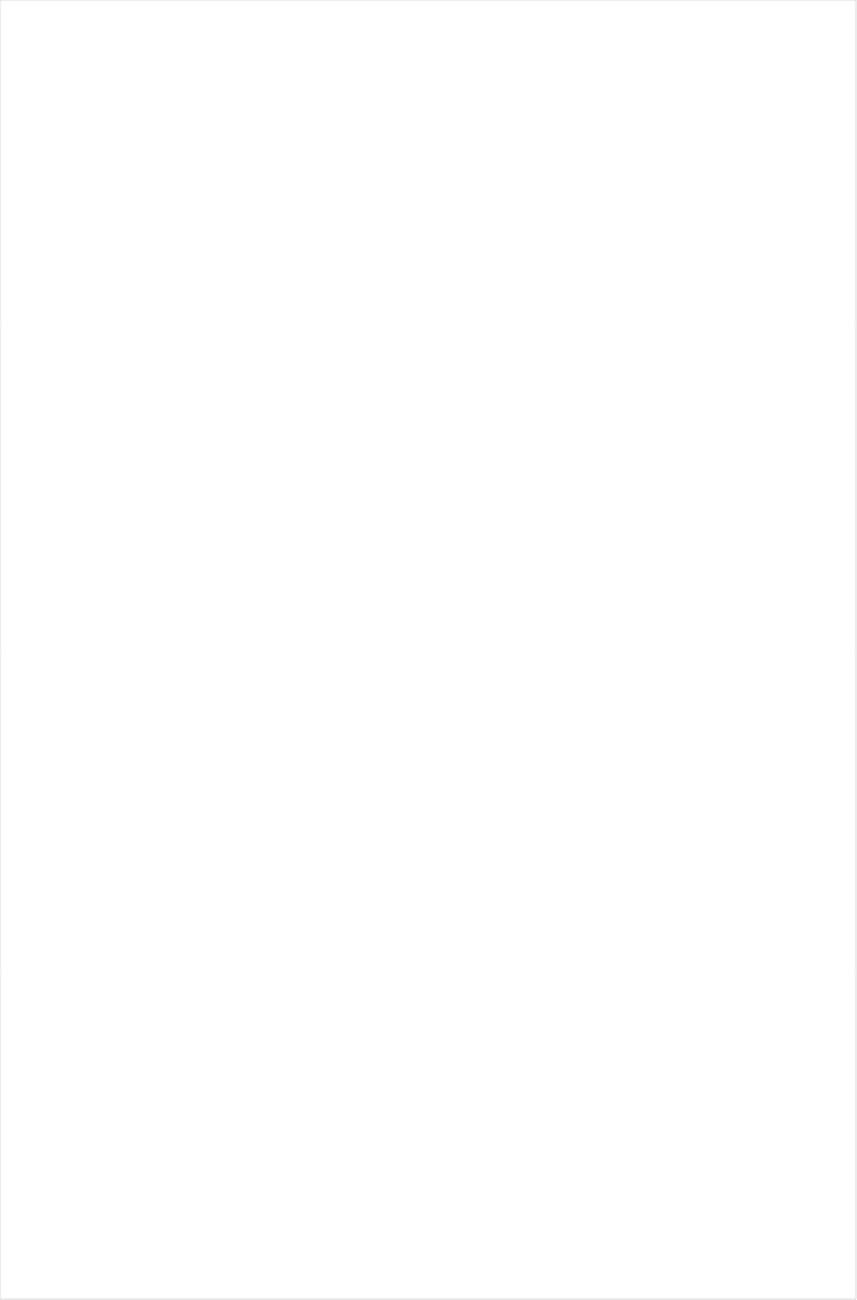
| Category | Total |
|---|---|
| Galavision | -0.946 |
| Telemundo | -0.886 |
| UniMas | -0.871 |
| Univision | -0.87 |
| TUDN | -0.853 |
| BET | -0.826 |
| NBC Universo | -0.755 |
| TV ONE | -0.732 |
| BET Her | -0.681 |
| VH1 | -0.604 |
| Lifetime Movies | -0.521 |
| Oprah Winfrey Network | -0.448 |
| Cartoon Network | -0.425 |
| INSP | -0.377 |
| Disney Channel | -0.333 |
| Disney XD | -0.328 |
| Universal Kids | -0.304 |
| WE TV | -0.295 |
| Disney Junior US | -0.274 |
| Logo | -0.267 |
| Nick Jr. | -0.263 |
| RFD TV | -0.254 |
| Hallmark | -0.254 |
| Lifetime | -0.226 |
| Nick | -0.201 |
| TLC | -0.188 |
| Hallmark Movies & Mysteries | -0.175 |
| Investigation Discovery | -0.169 |
| Nick Toons | -0.134 |
| OXYGEN | -0.119 |
| UP TV | -0.111 |
| POP | -0.076 |
| MTV2 | -0.063 |
| Discovery Family Channel | -0.057 |
| ION | -0.046 |
| Headline News | -0.013 |
| Great American Country | 0.012 |
| Adult Swim | 0.02 |
| Travel | 0.024 |
| CW | 0.031 |
| Game Show | 0.054 |
| A&E | 0.074 |
| Teen Nick | 0.076 |
| HGTV | 0.083 |
| BRAVO | 0.085 |
| FX Movie Channel | 0.092 |
| Ovation | 0.114 |
| Nick@Nite | 0.121 |
| E! | 0.14 |
| MyNetworkTV | 0.143 |
| National Geographic Wild | 0.156 |
| MSNBC | 0.157 |
| TV LAND | 0.158 |
| MTV | 0.17 |
| CBS | 0.17 |
| FOX | 0.173 |
| USA Network | 0.174 |
| CMTV | 0.177 |
| SYFY | 0.177 |
| FX | 0.18 |
| Freeform | 0.195 |
| ABC | 0.195 |
| Fox Business | 0.204 |
| CNN | 0.206 |
| Reelz Channel | 0.214 |
| Motor Trend Network | 0.218 |
| TNT | 0.238 |
| TBS | 0.249 |
| WGN America | 0.26 |
| NBC | 0.289 |
| Weather Channel | 0.289 |
| BBC America | 0.297 |
| Discovery Channel | 0.302 |
| Fox News | 0.324 |
| DIY | 0.334 |
| Cooking Channel | 0.347 |
| AMC | 0.351 |
| PBS | 0.355 |
| Science Channel | 0.366 |
| SundanceTV | 0.369 |
| Discovery Life Channel | 0.37 |
| FXX | 0.38 |
| Animal Planet | 0.392 |
| American Heroes Channel | 0.397 |
| Paramount Network | 0.398 |
| History Channel | 0.412 |
| FYI | 0.417 |
| Food Network | 0.418 |
| Viceland | 0.42 |
| ESPN Deportes | 0.423 |
| NBA TV | 0.465 |
| National Geographic | 0.49 |
| CNBC | 0.512 |
| Outdoor Channel | 0.591 |
| Comedy Central | 0.604 |
| Destination America | 0.611 |
| truTV | 0.633 |
| Smithsonian | 0.637 |
| Tennis Channel | 0.663 |
| Bloomberg HD | 0.669 |
| The Sportsman Channel | 0.809 |
| Independent Film (IFC) | 0.86 |
| PAC-12 Network | 1.028 |
| ESPNEWS | 1.157 |
| Olympic Channel | 1.167 |
| ESPN | 1.283 |
| FXDEP | 1.348 |
| NFL Network | 1.352 |
| Big Ten Network | 1.371 |
| Fox Sports 1 | 1.475 |
| ESPNU | 1.555 |
| CBS Sports | 1.571 |
| ESPN2 | 1.583 |
| Golf | 1.861 |
| FOX Sports 2 | 1.929 |
| NBC Sports | 2.042 |
| MLB Network | 2.308 |
| NHL | 17.11 |